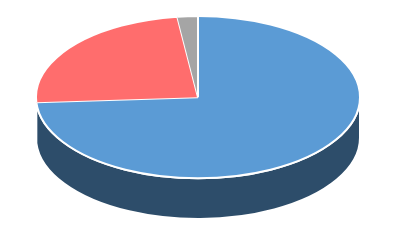
| Category | Series 0 |
|---|---|
| Sí | 0.74 |
| No | 0.24 |
| Ns/Nr | 0.02 |